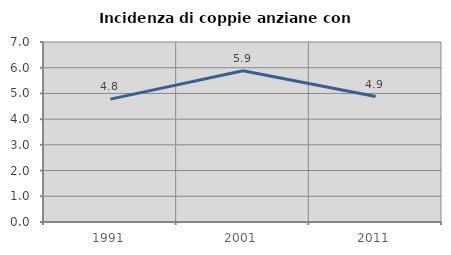
| Category | Incidenza di coppie anziane con figli |
|---|---|
| 1991.0 | 4.778 |
| 2001.0 | 5.882 |
| 2011.0 | 4.878 |